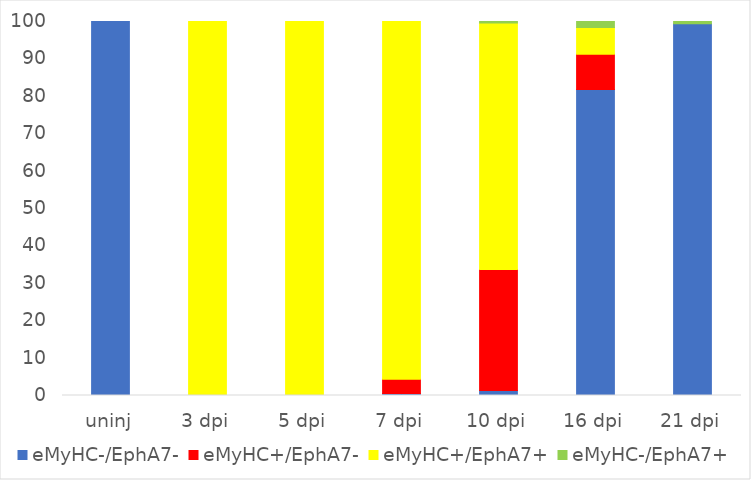
| Category | eMyHC-/EphA7- | eMyHC+/EphA7- | eMyHC+/EphA7+ | eMyHC-/EphA7+ |
|---|---|---|---|---|
| uninj | 100 | 0 | 0 | 0 |
| 3 dpi | 0 | 0 | 100 | 0 |
| 5 dpi | 0 | 0 | 100 | 0 |
| 7 dpi | 0.545 | 3.815 | 95.913 | 0 |
| 10 dpi | 1.341 | 32.375 | 65.9 | 0.383 |
| 16 dpi | 81.798 | 9.438 | 7.191 | 1.573 |
| 21 dpi | 99.429 | 0 | 0 | 0.571 |